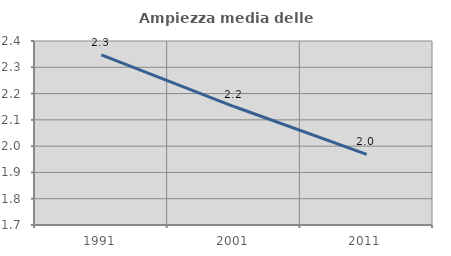
| Category | Ampiezza media delle famiglie |
|---|---|
| 1991.0 | 2.347 |
| 2001.0 | 2.151 |
| 2011.0 | 1.969 |